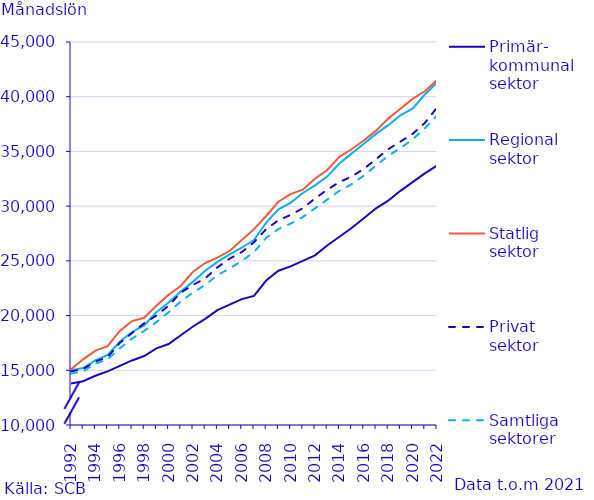
| Category | Primär-
kommunal
sektor | Regional
sektor | Statlig
sektor | Privat
sektor | Samtliga
sektorer |
|---|---|---|---|---|---|
| 1992.0 | 13800 | 15000 | 15100 | 14900 | 14700 |
| 1993.0 | 14000 | 15200 | 16000 | 15100 | 14900 |
| 1994.0 | 14500 | 15900 | 16800 | 15800 | 15600 |
| 1995.0 | 14900 | 16400 | 17200 | 16200 | 16000 |
| 1996.0 | 15400 | 17600 | 18600 | 17500 | 17000 |
| 1997.0 | 15900 | 18500 | 19500 | 18400 | 17900 |
| 1998.0 | 16300 | 19100 | 19800 | 19300 | 18600 |
| 1999.0 | 17000 | 20300 | 20900 | 20000 | 19400 |
| 2000.0 | 17400 | 21200 | 21900 | 20900 | 20300 |
| 2001.0 | 18200 | 22200 | 22700 | 22100 | 21300 |
| 2002.0 | 19000 | 23100 | 24000 | 22800 | 22100 |
| 2003.0 | 19700 | 24100 | 24800 | 23400 | 22800 |
| 2004.0 | 20500 | 24900 | 25300 | 24400 | 23700 |
| 2005.0 | 21000 | 25600 | 25900 | 25200 | 24300 |
| 2006.0 | 21500 | 26200 | 26900 | 25800 | 25000 |
| 2007.0 | 21800 | 26900 | 27900 | 26700 | 25800 |
| 2008.0 | 23200 | 28500 | 29100 | 27900 | 27100 |
| 2009.0 | 24100 | 29700 | 30400 | 28700 | 27900 |
| 2010.0 | 24500 | 30300 | 31100 | 29200 | 28400 |
| 2011.0 | 25000 | 31200 | 31500 | 29800 | 29000 |
| 2012.0 | 25500 | 31900 | 32500 | 30700 | 29800 |
| 2013.0 | 26400 | 32700 | 33300 | 31500 | 30600 |
| 2014.0 | 27200 | 33900 | 34500 | 32200 | 31400 |
| 2015.0 | 28000 | 34800 | 35200 | 32700 | 32000 |
| 2016.0 | 28900 | 35700 | 36000 | 33400 | 32800 |
| 2017.0 | 29800 | 36600 | 36900 | 34300 | 33700 |
| 2018.0 | 30500 | 37400 | 38000 | 35200 | 34600 |
| 2019.0 | 31400 | 38300 | 38900 | 35900 | 35300 |
| 2020.0 | 32200 | 38900 | 39800 | 36600 | 36100 |
| 2021.0 | 33000 | 40200 | 40500 | 37600 | 37100 |
| 2022.0 | 33700 | 41300 | 41500 | 39000 | 38300 |